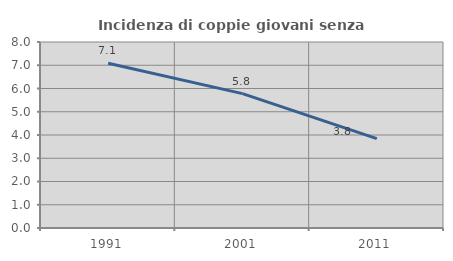
| Category | Incidenza di coppie giovani senza figli |
|---|---|
| 1991.0 | 7.086 |
| 2001.0 | 5.78 |
| 2011.0 | 3.844 |